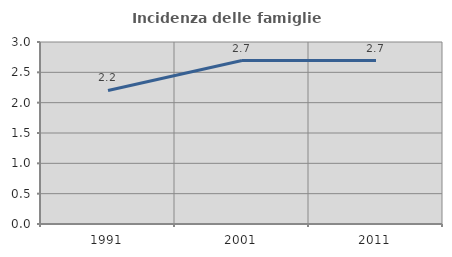
| Category | Incidenza delle famiglie numerose |
|---|---|
| 1991.0 | 2.201 |
| 2001.0 | 2.695 |
| 2011.0 | 2.695 |